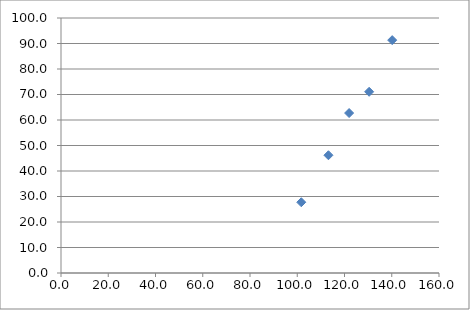
| Category | Series 0 |
|---|---|
| 140.18691588785043 | 91.318 |
| 130.43478260869566 | 71.061 |
| 121.95121951219512 | 62.727 |
| 113.20754716981133 | 46.182 |
| 101.69491525423729 | 27.745 |
| nan | 88.97 |